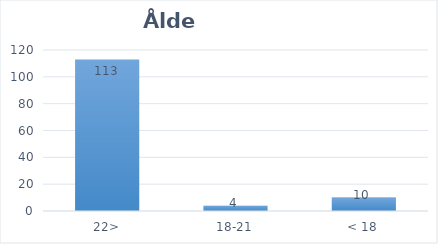
| Category | Series 0 |
|---|---|
| 22> | 113 |
| 18-21 | 4 |
| < 18 | 10 |